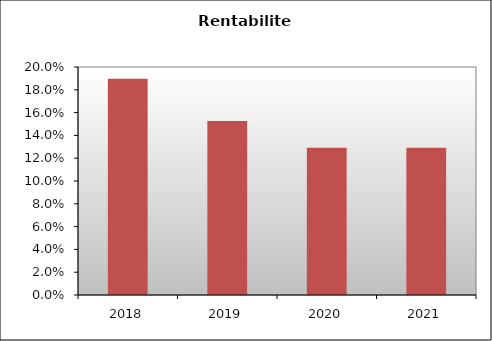
| Category | Series 1 |
|---|---|
| 2018.0 | 0.19 |
| 2019.0 | 0.153 |
| 2020.0 | 0.129 |
| 2021.0 | 0.129 |